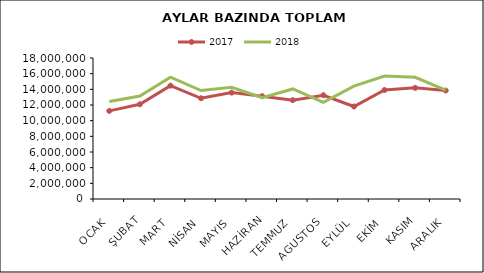
| Category | 2017 | 2018 |
|---|---|---|
| OCAK | 11247585.677 | 12434415.589 |
| ŞUBAT | 12089908.934 | 13148699.174 |
| MART | 14470814.059 | 15554312.071 |
| NİSAN | 12859938.791 | 13847621.73 |
| MAYIS | 13582079.731 | 14258671.819 |
| HAZİRAN | 13125306.944 | 12926040.042 |
| TEMMUZ | 12612074.056 | 14051020.026 |
| AGUSTOS | 13248462.99 | 12339775.799 |
| EYLÜL | 11810080.805 | 14404704.121 |
| EKİM | 13912699.494 | 15691717.07 |
| KASIM | 14188323.116 | 15528896.39 |
| ARALIK | 13845665.817 | 13901762.821 |